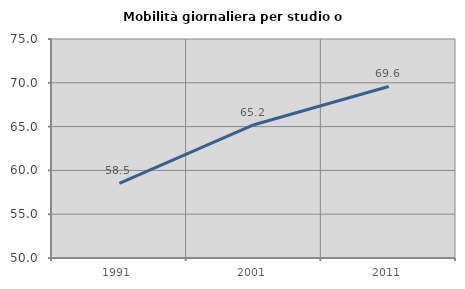
| Category | Mobilità giornaliera per studio o lavoro |
|---|---|
| 1991.0 | 58.53 |
| 2001.0 | 65.216 |
| 2011.0 | 69.584 |